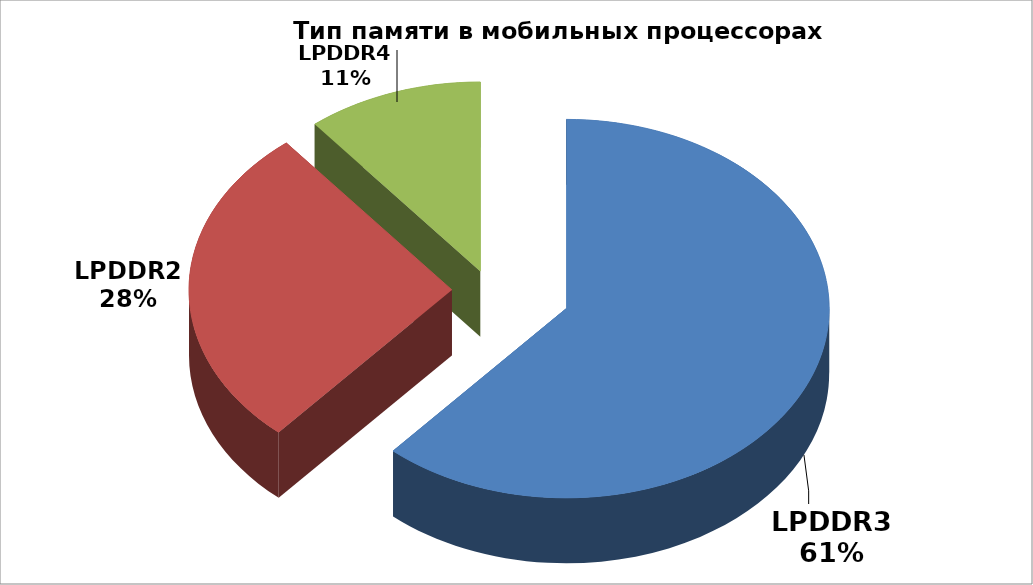
| Category | Series 0 |
|---|---|
| LPDDR3 | 153 |
| LPDDR2 | 69 |
| LPDDR4 | 27 |